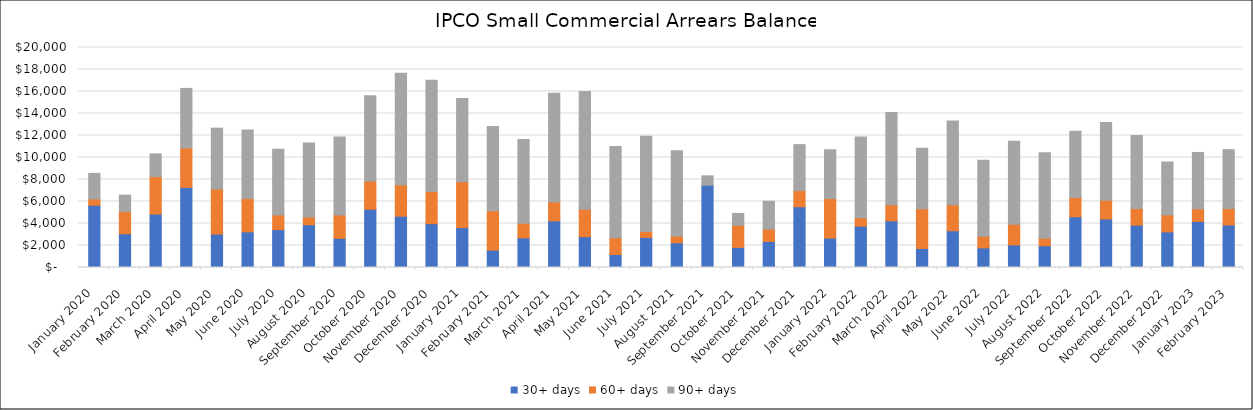
| Category | 30+ days | 60+ days | 90+ days |
|---|---|---|---|
| 2020-01-01 | 5658.41 | 575.02 | 2324.47 |
| 2020-02-01 | 3070.24 | 2027.59 | 1483.93 |
| 2020-03-01 | 4857.83 | 3406.98 | 2062.26 |
| 2020-04-01 | 7284.78 | 3581.37 | 5413.68 |
| 2020-05-01 | 3040.44 | 4097.19 | 5528.66 |
| 2020-06-01 | 3243.76 | 3026.64 | 6221.81 |
| 2020-07-01 | 3447.58 | 1334.77 | 5962.7 |
| 2020-08-01 | 3887.19 | 698.56 | 6743.57 |
| 2020-09-01 | 2651.65 | 2111.84 | 7099.91 |
| 2020-10-01 | 5294.93 | 2559.26 | 7754.3 |
| 2020-11-01 | 4665.21 | 2848.7 | 10141.93 |
| 2020-12-01 | 3983.66 | 2930.57 | 10114.38 |
| 2021-01-01 | 3625 | 4168 | 7580 |
| 2021-02-01 | 1573.58 | 3581.15 | 7667.39 |
| 2021-03-01 | 2698.59 | 1321.58 | 7615.87 |
| 2021-04-01 | 4242.26 | 1717.02 | 9878.49 |
| 2021-05-01 | 2801.41 | 2499.97 | 10700.33 |
| 2021-06-01 | 1180.99 | 1514 | 8311.44 |
| 2021-07-01 | 2736.3 | 525.41 | 8668.15 |
| 2021-08-01 | 2249.82 | 621.81 | 7745.61 |
| 2021-09-01 | 7481.33 | 0 | 850.96 |
| 2021-10-01 | 1829.47 | 2007.28 | 1078.83 |
| 2021-11-01 | 2366.27 | 1118.07 | 2536.13 |
| 2021-12-01 | 5522.68 | 1469.93 | 4177.5 |
| 2022-01-01 | 2675.22 | 3591.34 | 4438.52 |
| 2022-02-01 | 3756.22 | 774.69 | 7339.74 |
| 2022-03-01 | 4241.48 | 1457.47 | 8395.06 |
| 2022-04-01 | 1728.71 | 3617.79 | 5496.52 |
| 2022-05-01 | 3337.22 | 2366.02 | 7618.41 |
| 2022-06-01 | 1786.09 | 1061.13 | 6896.99 |
| 2022-07-01 | 2047.55 | 1878.54 | 7544.02 |
| 2022-08-01 | 1980.27 | 686.52 | 7766.74 |
| 2022-09-01 | 4614.83 | 1751.61 | 6010.05 |
| 2022-10-01 | 4414.18 | 1688.83 | 7080.65 |
| 2022-11-01 | 3848.36 | 1510.53 | 6644.17 |
| 2022-12-01 | 3235.88 | 1547.7 | 4809.69 |
| 2023-01-01 | 4188.05 | 1149.85 | 5119.66 |
| 2023-02-01 | 3864.69 | 1490.81 | 5356.62 |